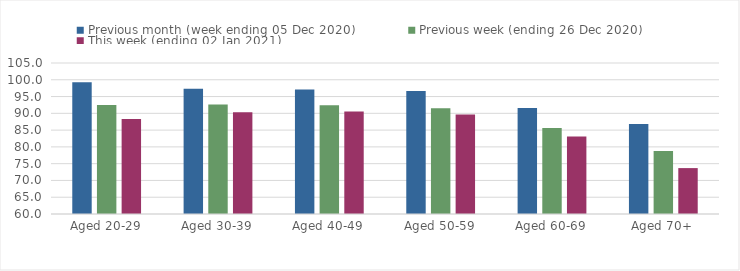
| Category | Previous month (week ending 05 Dec 2020) | Previous week (ending 26 Dec 2020) | This week (ending 02 Jan 2021) |
|---|---|---|---|
| Aged 20-29 | 99.29 | 92.51 | 88.33 |
| Aged 30-39 | 97.35 | 92.6 | 90.29 |
| Aged 40-49 | 97.08 | 92.4 | 90.53 |
| Aged 50-59 | 96.69 | 91.54 | 89.62 |
| Aged 60-69 | 91.6 | 85.61 | 83.06 |
| Aged 70+ | 86.81 | 78.8 | 73.68 |